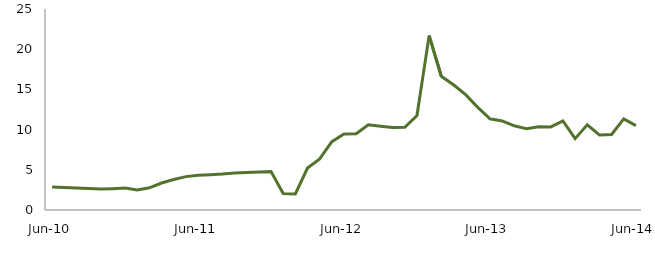
| Category | Series 0 |
|---|---|
| Jun-10 | 2.862 |
|  | 2.797 |
|  | 2.732 |
|  | 2.664 |
|  | 2.599 |
|  | 2.657 |
|  | 2.723 |
|  | 2.482 |
|  | 2.759 |
|  | 3.354 |
|  | 3.786 |
|  | 4.151 |
| Jun-11 | 4.328 |
|  | 4.398 |
|  | 4.464 |
|  | 4.588 |
|  | 4.679 |
|  | 4.725 |
|  | 4.771 |
|  | 2.048 |
|  | 1.991 |
|  | 5.225 |
|  | 6.354 |
|  | 8.497 |
| Jun-12 | 9.463 |
|  | 9.491 |
|  | 10.603 |
|  | 10.425 |
|  | 10.27 |
|  | 10.29 |
|  | 11.75 |
|  | 21.688 |
|  | 16.642 |
|  | 15.583 |
|  | 14.352 |
|  | 12.766 |
| Jun-13 | 11.347 |
|  | 11.081 |
|  | 10.473 |
|  | 10.123 |
|  | 10.344 |
|  | 10.337 |
|  | 11.09 |
|  | 8.878 |
|  | 10.595 |
|  | 9.33 |
|  | 9.398 |
|  | 11.339 |
| Jun-14 | 10.501 |